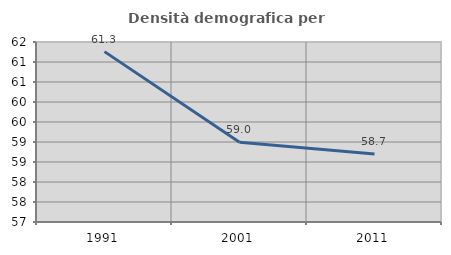
| Category | Densità demografica |
|---|---|
| 1991.0 | 61.259 |
| 2001.0 | 58.996 |
| 2011.0 | 58.701 |